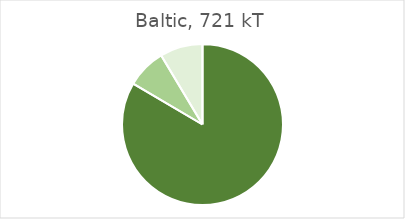
| Category | Baltic |
|---|---|
| Landings of assessed stocks for which adequate information is available to determine GES for F and/or SSB | 601917.355 |
| Landings of assessed stocks for which insufficient information is available to determine GES for F and/or SSB | 57409.13 |
| Landings unassessed stocks | 61896.745 |